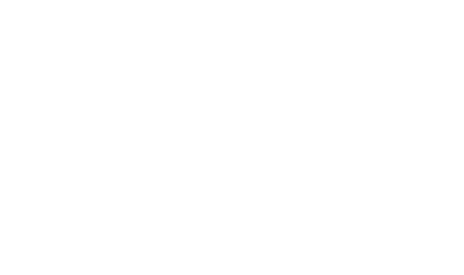
| Category | Series 0 |
|---|---|
| Producción Vegetal | 2315.73 |
| Producción Animal | 2568.17 |